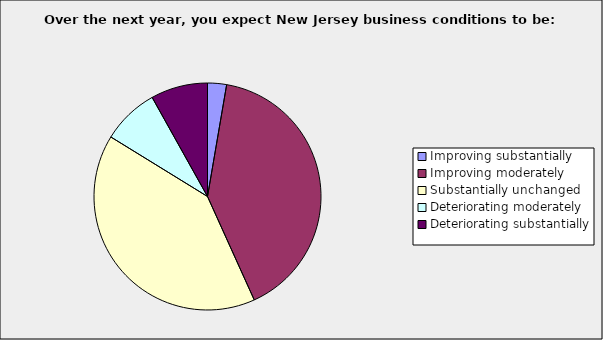
| Category | Series 0 |
|---|---|
| Improving substantially | 0.027 |
| Improving moderately | 0.405 |
| Substantially unchanged | 0.405 |
| Deteriorating moderately | 0.081 |
| Deteriorating substantially | 0.081 |